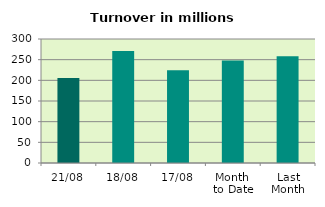
| Category | Series 0 |
|---|---|
| 21/08 | 205.791 |
| 18/08 | 271.148 |
| 17/08 | 224.291 |
| Month 
to Date | 247.837 |
| Last
Month | 258.125 |